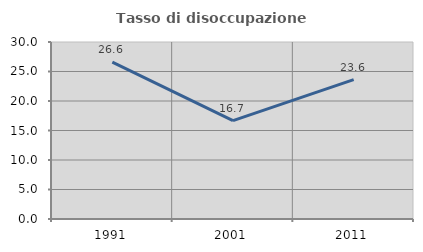
| Category | Tasso di disoccupazione giovanile  |
|---|---|
| 1991.0 | 26.601 |
| 2001.0 | 16.667 |
| 2011.0 | 23.636 |